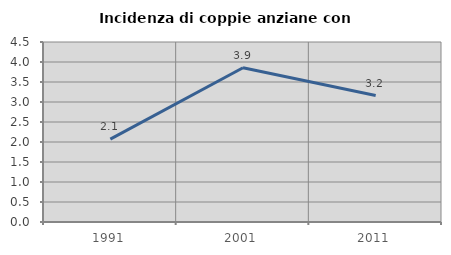
| Category | Incidenza di coppie anziane con figli |
|---|---|
| 1991.0 | 2.073 |
| 2001.0 | 3.855 |
| 2011.0 | 3.161 |